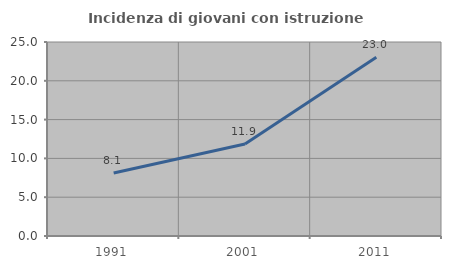
| Category | Incidenza di giovani con istruzione universitaria |
|---|---|
| 1991.0 | 8.108 |
| 2001.0 | 11.852 |
| 2011.0 | 23.027 |